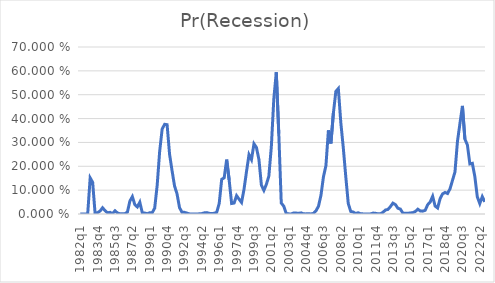
| Category | Pr(Recession) |
|---|---|
| 1982q1 | 0 |
| 1982q2 | 0 |
| 1982q3 | 0 |
| 1982q4 | 0 |
| 1983q1 | 0.151 |
| 1983q2 | 0.133 |
| 1983q3 | 0 |
| 1983q4 | 0.006 |
| 1984q1 | 0.013 |
| 1984q2 | 0.026 |
| 1984q3 | 0.014 |
| 1984q4 | 0.005 |
| 1985q1 | 0.007 |
| 1985q2 | 0.001 |
| 1985q3 | 0.014 |
| 1985q4 | 0.004 |
| 1986q1 | 0.001 |
| 1986q2 | 0.001 |
| 1986q3 | 0.001 |
| 1986q4 | 0.008 |
| 1987q1 | 0.054 |
| 1987q2 | 0.073 |
| 1987q3 | 0.039 |
| 1987q4 | 0.03 |
| 1988q1 | 0.049 |
| 1988q2 | 0.005 |
| 1988q3 | 0.004 |
| 1988q4 | 0.001 |
| 1989q1 | 0.005 |
| 1989q2 | 0.005 |
| 1989q3 | 0.024 |
| 1989q4 | 0.12 |
| 1990q1 | 0.262 |
| 1990q2 | 0.356 |
| 1990q3 | 0.376 |
| 1990q4 | 0.374 |
| 1991q1 | 0.25 |
| 1991q2 | 0.181 |
| 1991q3 | 0.117 |
| 1991q4 | 0.085 |
| 1992q1 | 0.027 |
| 1992q2 | 0.007 |
| 1992q3 | 0.007 |
| 1992q4 | 0.004 |
| 1993q1 | 0.001 |
| 1993q2 | 0 |
| 1993q3 | 0 |
| 1993q4 | 0 |
| 1994q1 | 0.001 |
| 1994q2 | 0.002 |
| 1994q3 | 0.005 |
| 1994q4 | 0.006 |
| 1995q1 | 0.003 |
| 1995q2 | 0.002 |
| 1995q3 | 0.003 |
| 1995q4 | 0.007 |
| 1996q1 | 0.044 |
| 1996q2 | 0.145 |
| 1996q3 | 0.152 |
| 1996q4 | 0.228 |
| 1997q1 | 0.143 |
| 1997q2 | 0.044 |
| 1997q3 | 0.046 |
| 1997q4 | 0.077 |
| 1998q1 | 0.062 |
| 1998q2 | 0.048 |
| 1998q3 | 0.104 |
| 1998q4 | 0.178 |
| 1999q1 | 0.249 |
| 1999q2 | 0.228 |
| 1999q3 | 0.294 |
| 1999q4 | 0.279 |
| 2000q1 | 0.229 |
| 2000q2 | 0.121 |
| 2000q3 | 0.099 |
| 2000q4 | 0.124 |
| 2001q1 | 0.159 |
| 2001q2 | 0.282 |
| 2001q3 | 0.482 |
| 2001q4 | 0.594 |
| 2002q1 | 0.337 |
| 2002q2 | 0.046 |
| 2002q3 | 0.033 |
| 2002q4 | 0.002 |
| 2003q1 | 0.001 |
| 2003q2 | 0 |
| 2003q3 | 0.004 |
| 2003q4 | 0.004 |
| 2004q1 | 0.003 |
| 2004q2 | 0.005 |
| 2004q3 | 0.001 |
| 2004q4 | 0 |
| 2005q1 | 0.001 |
| 2005q2 | 0 |
| 2005q3 | 0.003 |
| 2005q4 | 0.013 |
| 2006q1 | 0.033 |
| 2006q2 | 0.078 |
| 2006q3 | 0.156 |
| 2006q4 | 0.203 |
| 2007q1 | 0.351 |
| 2007q2 | 0.296 |
| 2007q3 | 0.422 |
| 2007q4 | 0.514 |
| 2008q1 | 0.526 |
| 2008q2 | 0.383 |
| 2008q3 | 0.277 |
| 2008q4 | 0.156 |
| 2009q1 | 0.044 |
| 2009q2 | 0.011 |
| 2009q3 | 0.008 |
| 2009q4 | 0.002 |
| 2010q1 | 0.005 |
| 2010q2 | 0.001 |
| 2010q3 | 0 |
| 2010q4 | 0 |
| 2011q1 | 0 |
| 2011q2 | 0 |
| 2011q3 | 0.004 |
| 2011q4 | 0.003 |
| 2012q1 | 0.001 |
| 2012q2 | 0.001 |
| 2012q3 | 0.007 |
| 2012q4 | 0.017 |
| 2013q1 | 0.019 |
| 2013q2 | 0.031 |
| 2013q3 | 0.046 |
| 2013q4 | 0.039 |
| 2014q1 | 0.024 |
| 2014q2 | 0.021 |
| 2014q3 | 0.004 |
| 2014q4 | 0.003 |
| 2015q1 | 0.003 |
| 2015q2 | 0.004 |
| 2015q3 | 0.006 |
| 2015q4 | 0.01 |
| 2016q1 | 0.02 |
| 2016q2 | 0.013 |
| 2016q3 | 0.012 |
| 2016q4 | 0.016 |
| 2017q1 | 0.039 |
| 2017q2 | 0.05 |
| 2017q3 | 0.074 |
| 2017q4 | 0.033 |
| 2018q1 | 0.025 |
| 2018q2 | 0.064 |
| 2018q3 | 0.084 |
| 2018q4 | 0.09 |
| 2019q1 | 0.086 |
| 2019q2 | 0.106 |
| 2019q3 | 0.141 |
| 2019q4 | 0.176 |
| 2020q1 | 0.304 |
| 2020q2 | 0.379 |
| 2020q3 | 0.453 |
| 2020q4 | 0.314 |
| 2021q1 | 0.29 |
| 2021q2 | 0.21 |
| 2021q3 | 0.212 |
| 2021q4 | 0.157 |
| 2022q1 | 0.072 |
| 2022q2 | 0.043 |
| 2022q3 | 0.073 |
| 2022q4 | 0.051 |